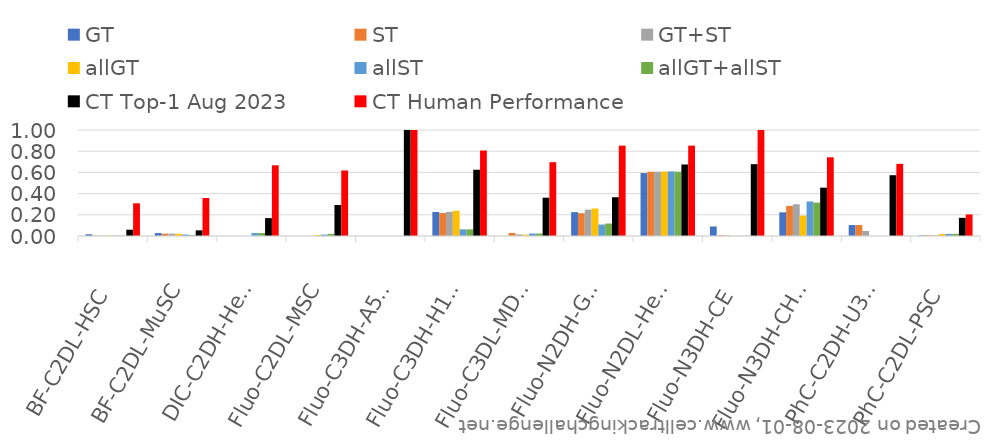
| Category | GT | ST | GT+ST | allGT | allST | allGT+allST | CT Top-1 Aug 2023 | CT Human Performance |
|---|---|---|---|---|---|---|---|---|
| BF-C2DL-HSC | 0.016 | 0.003 | 0.003 | 0.005 | 0.003 | 0.003 | 0.059 | 0.308 |
| BF-C2DL-MuSC | 0.028 | 0.022 | 0.022 | 0.02 | 0.014 | 0.008 | 0.053 | 0.358 |
| DIC-C2DH-HeLa | 0 | 0 | 0 | 0 | 0.028 | 0.028 | 0.169 | 0.667 |
| Fluo-C2DL-MSC | 0 | 0 | 0 | 0.009 | 0.014 | 0.02 | 0.293 | 0.618 |
| Fluo-C3DH-A549 | 0 | 0 | 0 | 0 | 0 | 0 | 1 | 1 |
| Fluo-C3DH-H157 | 0.227 | 0.217 | 0.227 | 0.238 | 0.062 | 0.062 | 0.625 | 0.806 |
| Fluo-C3DL-MDA231 | 0 | 0.029 | 0.015 | 0.013 | 0.024 | 0.023 | 0.361 | 0.696 |
| Fluo-N2DH-GOWT1 | 0.225 | 0.215 | 0.248 | 0.259 | 0.108 | 0.117 | 0.366 | 0.852 |
| Fluo-N2DL-HeLa | 0.594 | 0.606 | 0.606 | 0.608 | 0.609 | 0.606 | 0.674 | 0.852 |
| Fluo-N3DH-CE | 0.09 | 0.006 | 0.006 | 0.002 | 0.002 | 0.002 | 0.678 | 1 |
| Fluo-N3DH-CHO | 0.223 | 0.284 | 0.3 | 0.193 | 0.326 | 0.315 | 0.456 | 0.743 |
| PhC-C2DH-U373 | 0.103 | 0.103 | 0.048 | 0 | 0 | 0 | 0.573 | 0.681 |
| PhC-C2DL-PSC | 0.005 | 0.008 | 0.007 | 0.019 | 0.02 | 0.02 | 0.171 | 0.203 |